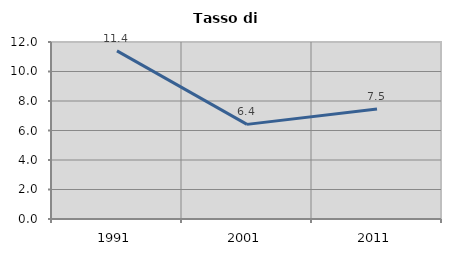
| Category | Tasso di disoccupazione   |
|---|---|
| 1991.0 | 11.397 |
| 2001.0 | 6.416 |
| 2011.0 | 7.465 |